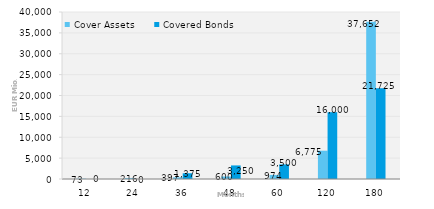
| Category | Cover Assets | Covered Bonds |
|---|---|---|
| 12.0 | 72.791 | 0 |
| 24.0 | 215.605 | 0 |
| 36.0 | 396.962 | 1375 |
| 48.0 | 600.243 | 3250 |
| 60.0 | 973.777 | 3500 |
| 120.0 | 6775.234 | 16000 |
| 180.0 | 37651.655 | 21725 |